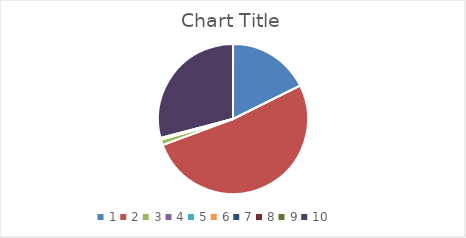
| Category | Series 0 |
|---|---|
| 0 | 0.18 |
| 1 | 0.527 |
| 2 | 0.013 |
| 3 | 0 |
| 4 | 0 |
| 5 | 0 |
| 6 | 0 |
| 7 | 0 |
| 8 | 0.003 |
| 9 | 0.297 |